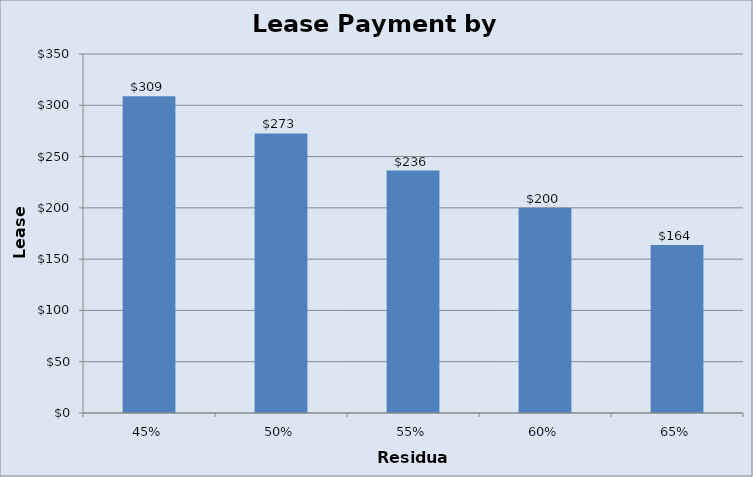
| Category | Lease Payment by Residual |
|---|---|
| 0.45 | 308.919 |
| 0.5 | 272.609 |
| 0.55 | 236.299 |
| 0.6 | 199.99 |
| 0.65 | 163.68 |